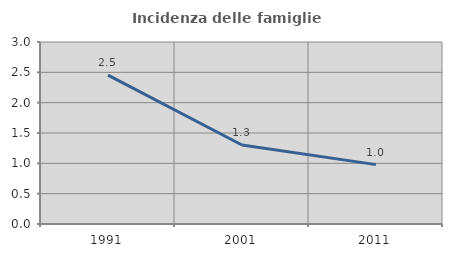
| Category | Incidenza delle famiglie numerose |
|---|---|
| 1991.0 | 2.455 |
| 2001.0 | 1.302 |
| 2011.0 | 0.979 |